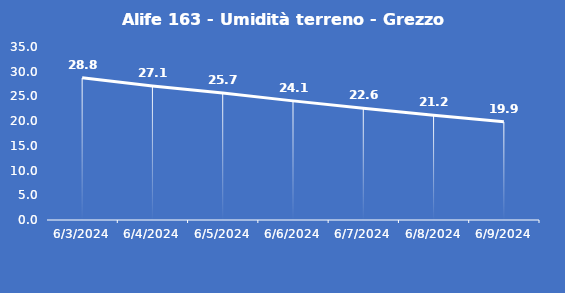
| Category | Alife 163 - Umidità terreno - Grezzo (%VWC) |
|---|---|
| 6/3/24 | 28.8 |
| 6/4/24 | 27.1 |
| 6/5/24 | 25.7 |
| 6/6/24 | 24.1 |
| 6/7/24 | 22.6 |
| 6/8/24 | 21.2 |
| 6/9/24 | 19.9 |